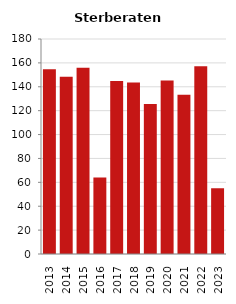
| Category | Sterberate der Bevölkerung ab 80 Jahre (auf Tsd.) |
|---|---|
| 2013.0 | 154.696 |
| 2014.0 | 148.352 |
| 2015.0 | 155.914 |
| 2016.0 | 64.039 |
| 2017.0 | 144.928 |
| 2018.0 | 143.519 |
| 2019.0 | 125.541 |
| 2020.0 | 145.299 |
| 2021.0 | 133.333 |
| 2022.0 | 157.258 |
| 2023.0 | 55.147 |